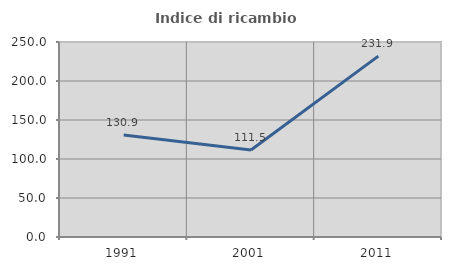
| Category | Indice di ricambio occupazionale  |
|---|---|
| 1991.0 | 130.882 |
| 2001.0 | 111.475 |
| 2011.0 | 231.868 |